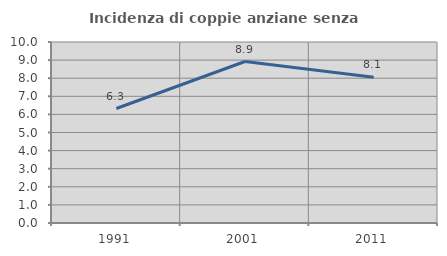
| Category | Incidenza di coppie anziane senza figli  |
|---|---|
| 1991.0 | 6.324 |
| 2001.0 | 8.922 |
| 2011.0 | 8.051 |